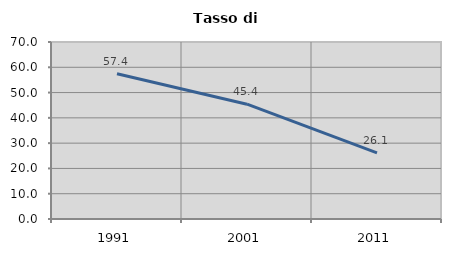
| Category | Tasso di disoccupazione   |
|---|---|
| 1991.0 | 57.447 |
| 2001.0 | 45.399 |
| 2011.0 | 26.148 |